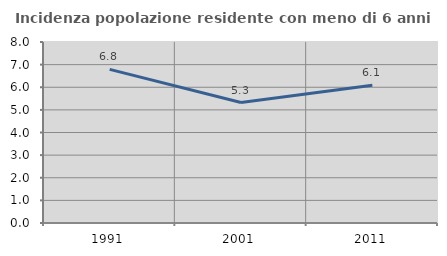
| Category | Incidenza popolazione residente con meno di 6 anni |
|---|---|
| 1991.0 | 6.788 |
| 2001.0 | 5.323 |
| 2011.0 | 6.085 |